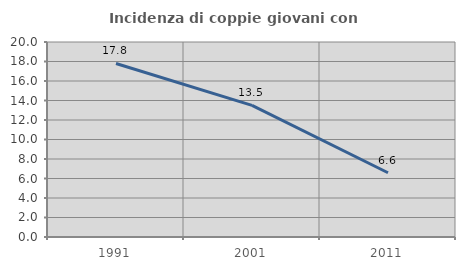
| Category | Incidenza di coppie giovani con figli |
|---|---|
| 1991.0 | 17.798 |
| 2001.0 | 13.494 |
| 2011.0 | 6.591 |